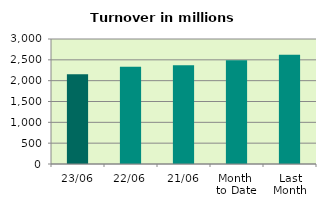
| Category | Series 0 |
|---|---|
| 23/06 | 2156.384 |
| 22/06 | 2332.05 |
| 21/06 | 2372.24 |
| Month 
to Date | 2487.137 |
| Last
Month | 2619.784 |